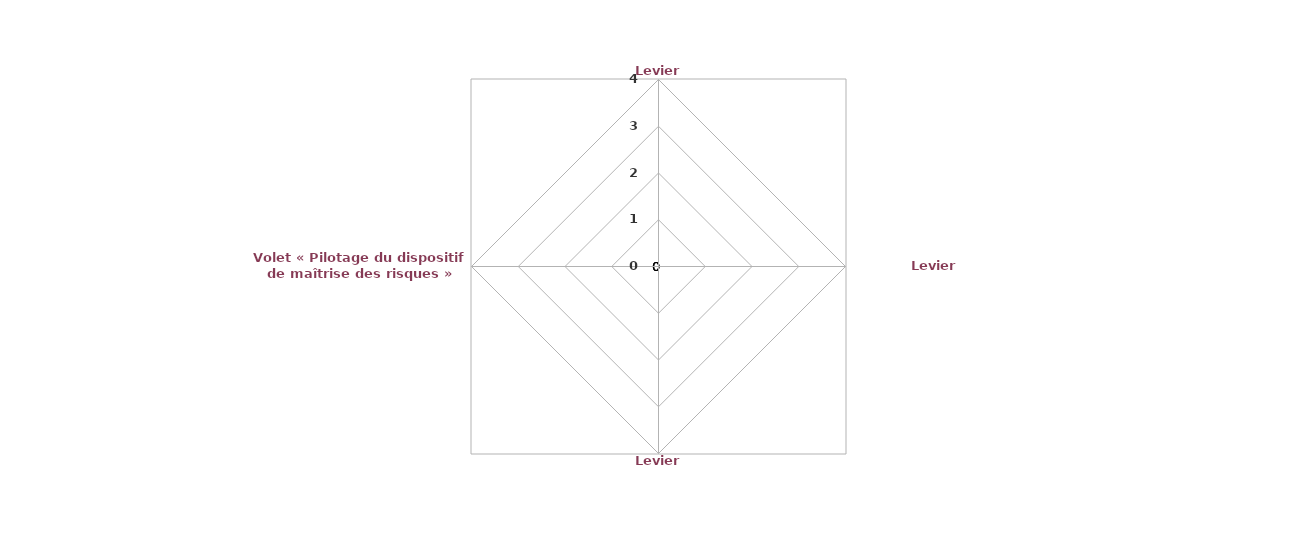
| Category | Series 0 |
|---|---|
| Levier « Organisation » | 0 |
| Levier « Documentation » | 0 |
| Levier « Traçabilité » | 0 |
| Volet « Pilotage du dispositif de maîtrise des risques » | 0 |